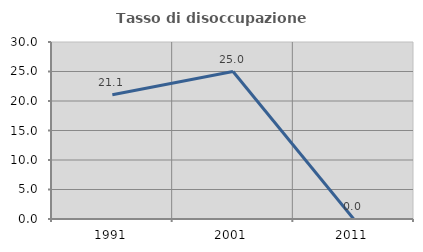
| Category | Tasso di disoccupazione giovanile  |
|---|---|
| 1991.0 | 21.053 |
| 2001.0 | 25 |
| 2011.0 | 0 |